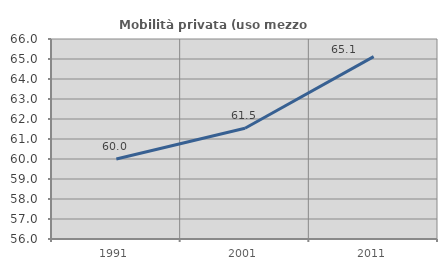
| Category | Mobilità privata (uso mezzo privato) |
|---|---|
| 1991.0 | 60 |
| 2001.0 | 61.538 |
| 2011.0 | 65.116 |